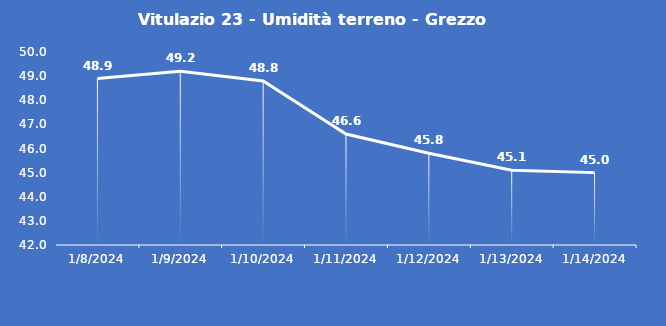
| Category | Vitulazio 23 - Umidità terreno - Grezzo (%VWC) |
|---|---|
| 1/8/24 | 48.9 |
| 1/9/24 | 49.2 |
| 1/10/24 | 48.8 |
| 1/11/24 | 46.6 |
| 1/12/24 | 45.8 |
| 1/13/24 | 45.1 |
| 1/14/24 | 45 |